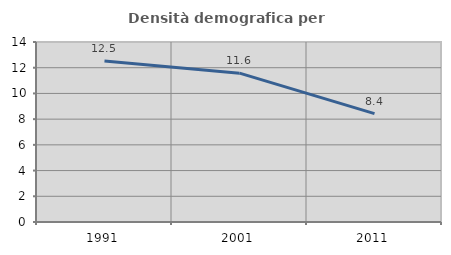
| Category | Densità demografica |
|---|---|
| 1991.0 | 12.526 |
| 2001.0 | 11.576 |
| 2011.0 | 8.43 |